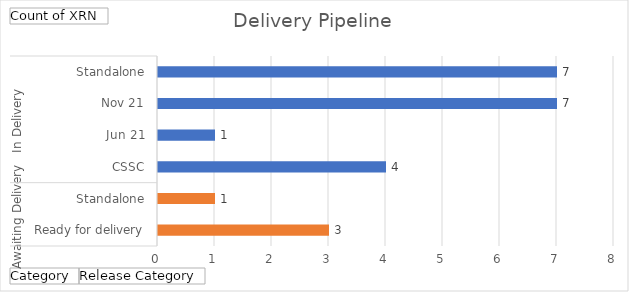
| Category | Total |
|---|---|
| 0 | 3 |
| 1 | 1 |
| 2 | 4 |
| 3 | 1 |
| 4 | 7 |
| 5 | 7 |